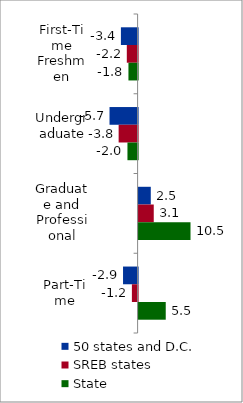
| Category | 50 states and D.C. | SREB states | State |
|---|---|---|---|
| First-Time Freshmen | -3.373 | -2.18 | -1.85 |
| Undergraduate | -5.674 | -3.832 | -2.05 |
| Graduate and Professional | 2.463 | 3.061 | 10.486 |
| Part-Time | -2.944 | -1.154 | 5.482 |